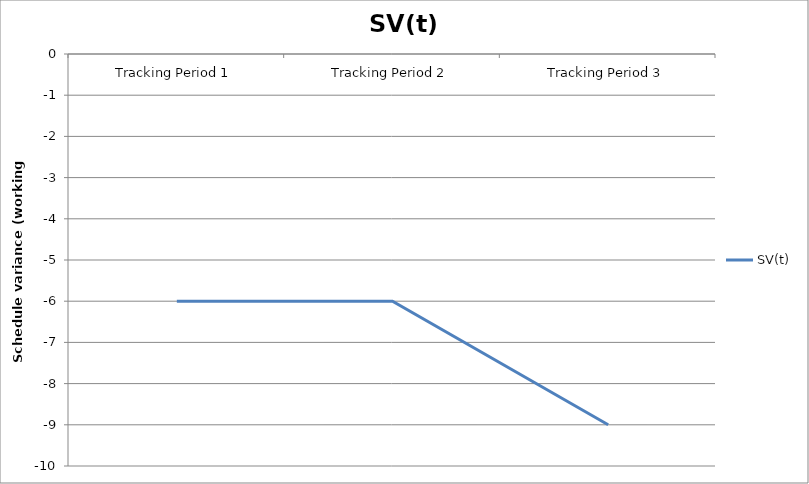
| Category | SV(t) |
|---|---|
| Tracking Period 1 | -6 |
| Tracking Period 2 | -6 |
| Tracking Period 3 | -9 |